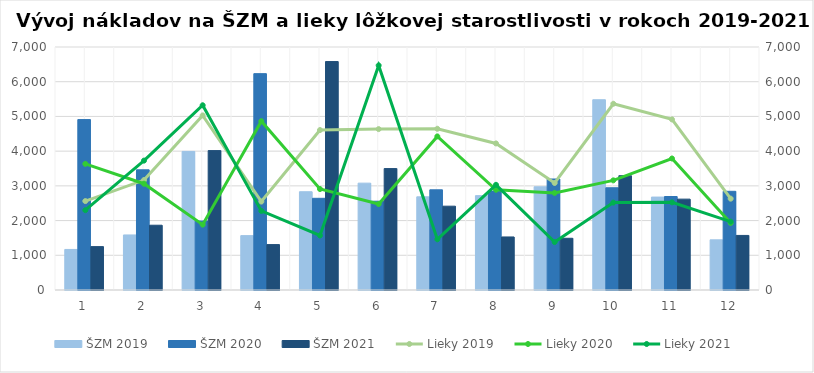
| Category | ŠZM 2019 | ŠZM 2020 | ŠZM 2021 |
|---|---|---|---|
| 0 | 1168.085 | 4909.107 | 1249.683 |
| 1 | 1585.397 | 3462.098 | 1866.075 |
| 2 | 3991.978 | 1986.495 | 4015.461 |
| 3 | 1566.079 | 6232.389 | 1308.409 |
| 4 | 2830.924 | 2641.484 | 6580.826 |
| 5 | 3077.895 | 2557.082 | 3497.494 |
| 6 | 2683.956 | 2885.784 | 2414.542 |
| 7 | 2718.515 | 2849.162 | 1527.806 |
| 8 | 2973.655 | 3197.232 | 1490.268 |
| 9 | 5481.015 | 2945.129 | 3292.677 |
| 10 | 2676.865 | 2693.338 | 2617.473 |
| 11 | 1445.472 | 2843.209 | 1571.768 |